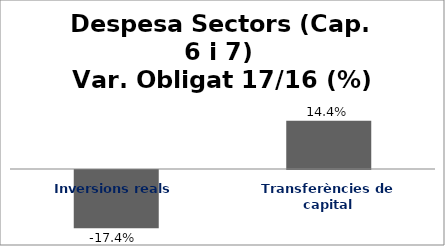
| Category | Series 0 |
|---|---|
| Inversions reals | -0.174 |
| Transferències de capital | 0.144 |